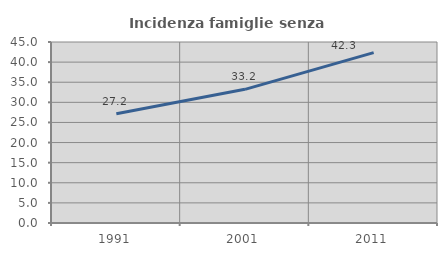
| Category | Incidenza famiglie senza nuclei |
|---|---|
| 1991.0 | 27.16 |
| 2001.0 | 33.234 |
| 2011.0 | 42.346 |